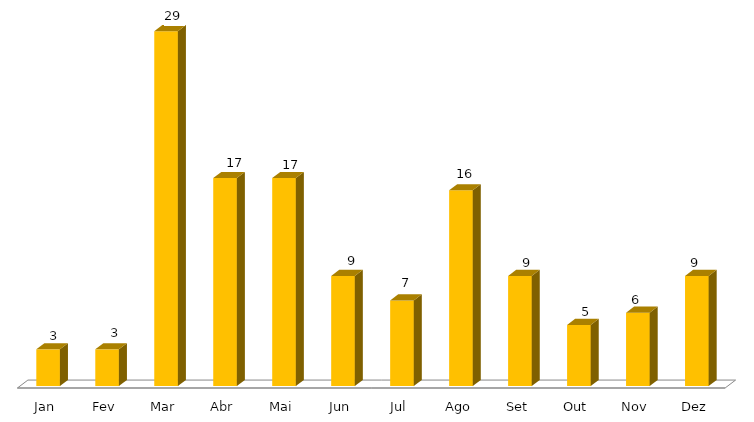
| Category | Projetos Iniciados em 2018 |
|---|---|
| Jan | 3 |
| Fev | 3 |
| Mar | 29 |
| Abr | 17 |
| Mai | 17 |
| Jun | 9 |
| Jul | 7 |
| Ago | 16 |
| Set | 9 |
| Out | 5 |
| Nov | 6 |
| Dez | 9 |